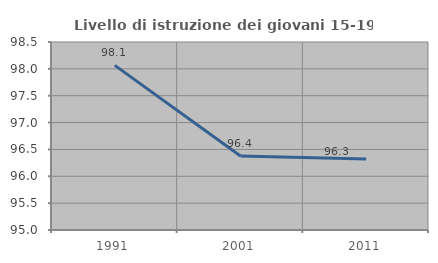
| Category | Livello di istruzione dei giovani 15-19 anni |
|---|---|
| 1991.0 | 98.065 |
| 2001.0 | 96.377 |
| 2011.0 | 96.324 |